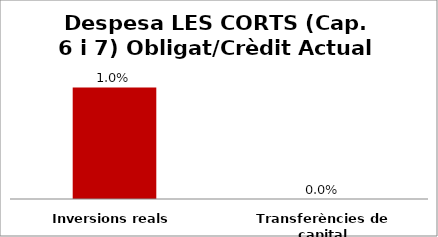
| Category | Series 0 |
|---|---|
| Inversions reals | 0.01 |
| Transferències de capital | 0 |